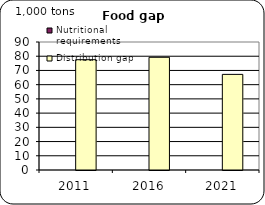
| Category | Nutritional requirements | Distribution gap |
|---|---|---|
| 2011.0 | 0 | 77.553 |
| 2016.0 | 0 | 79.252 |
| 2021.0 | 0 | 67.232 |